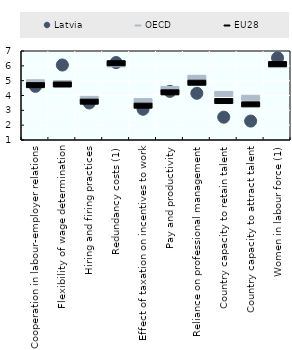
| Category | Latvia | OECD | EU28 |
|---|---|---|---|
| Cooperation in labour-employer relations | 4.618 | 4.923 | 4.732 |
| Flexibility of wage determination | 6.056 | 4.878 | 4.775 |
| Hiring and firing practices | 3.498 | 3.808 | 3.617 |
| Redundancy costs (1) | 6.22 | 6.133 | 6.21 |
| Effect of taxation on incentives to work | 3.076 | 3.654 | 3.348 |
| Pay and productivity | 4.279 | 4.476 | 4.247 |
| Reliance on professional management | 4.15 | 5.225 | 4.895 |
| Country capacity to retain talent | 2.538 | 4.14 | 3.661 |
| Country capacity to attract talent | 2.276 | 3.881 | 3.437 |
| Women in labour force (1) | 6.54 | 6.079 | 6.152 |